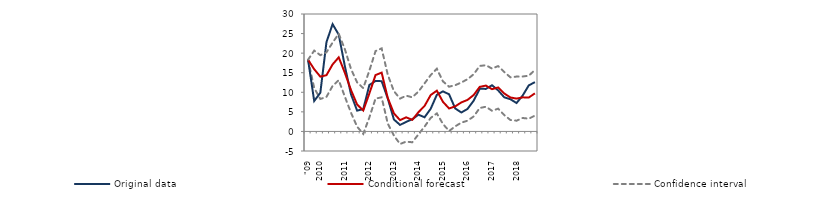
| Category | lower bound | Original data | Conditional forecast | Confidence interval |
|---|---|---|---|---|
| "09 | 18.309 | 18.309 | 18.309 | 18.309 |
|  | 11.087 | 7.773 | 15.896 | 20.65 |
| 2010 | 8.294 | 9.877 | 14.002 | 19.472 |
|  | 8.825 | 22.814 | 14.369 | 20.203 |
|  | 11.614 | 27.405 | 17.111 | 22.685 |
|  | 13.089 | 24.733 | 18.93 | 24.949 |
| 2011 | 8.876 | 16.678 | 14.981 | 21.009 |
|  | 4.775 | 9.478 | 10.587 | 15.957 |
|  | 1.219 | 5.321 | 6.872 | 12.522 |
|  | -0.628 | 5.685 | 5.343 | 11.072 |
| 2012 | 3.588 | 11.871 | 9.705 | 15.539 |
|  | 8.392 | 12.88 | 14.393 | 20.513 |
|  | 8.709 | 12.843 | 15.026 | 21.218 |
|  | 1.985 | 8.403 | 8.528 | 14.471 |
| 2013 | -1.059 | 3.051 | 4.608 | 10.282 |
|  | -3.218 | 1.662 | 2.891 | 8.39 |
|  | -2.597 | 2.442 | 3.6 | 9.127 |
|  | -2.774 | 3.113 | 2.964 | 8.724 |
| 2014 | -0.755 | 4.278 | 4.913 | 10.179 |
|  | 1.229 | 3.617 | 6.506 | 12.284 |
|  | 3.46 | 5.789 | 9.299 | 14.401 |
|  | 4.604 | 9.348 | 10.409 | 16.018 |
| 2015 | 1.897 | 10.241 | 7.562 | 12.786 |
|  | 0.112 | 9.479 | 5.862 | 11.426 |
|  | 1.297 | 5.868 | 6.404 | 11.811 |
|  | 2.248 | 4.842 | 7.422 | 12.507 |
| 2016 | 2.737 | 5.733 | 8.043 | 13.338 |
|  | 3.815 | 7.836 | 9.291 | 14.592 |
|  | 5.988 | 10.885 | 11.383 | 16.728 |
|  | 6.309 | 10.867 | 11.709 | 16.913 |
| 2017 | 5.278 | 11.801 | 10.793 | 16.061 |
|  | 5.815 | 10.488 | 11.234 | 16.696 |
|  | 4.177 | 8.715 | 9.697 | 15.187 |
|  | 2.92 | 8.225 | 8.67 | 13.816 |
| 2018 | 2.744 | 7.253 | 8.388 | 14.012 |